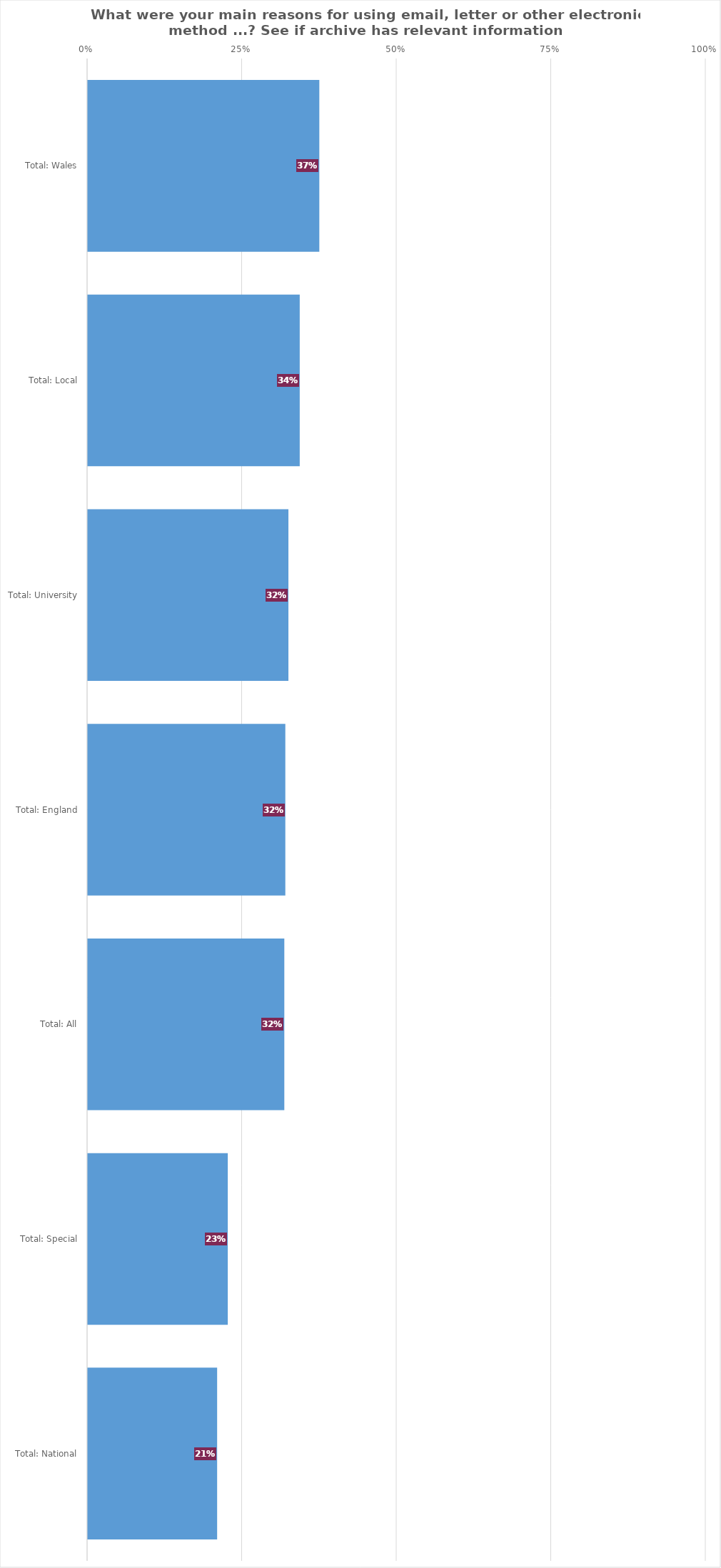
| Category | See if archive has relevant information |
|---|---|
| Total: Wales | 0.375 |
| Total: Local | 0.343 |
| Total: University | 0.325 |
| Total: England | 0.32 |
| Total: All | 0.318 |
| Total: Special | 0.226 |
| Total: National | 0.209 |